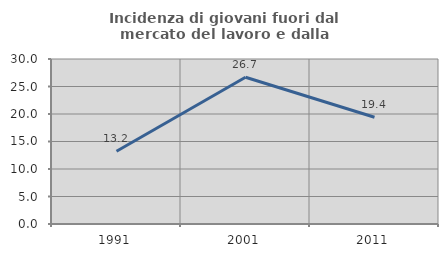
| Category | Incidenza di giovani fuori dal mercato del lavoro e dalla formazione  |
|---|---|
| 1991.0 | 13.238 |
| 2001.0 | 26.685 |
| 2011.0 | 19.417 |